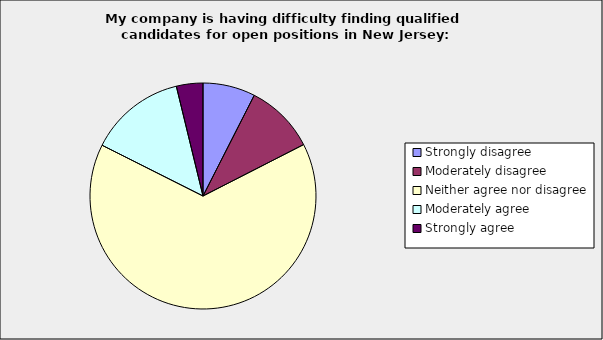
| Category | Series 0 |
|---|---|
| Strongly disagree | 0.075 |
| Moderately disagree | 0.1 |
| Neither agree nor disagree | 0.65 |
| Moderately agree | 0.138 |
| Strongly agree | 0.038 |